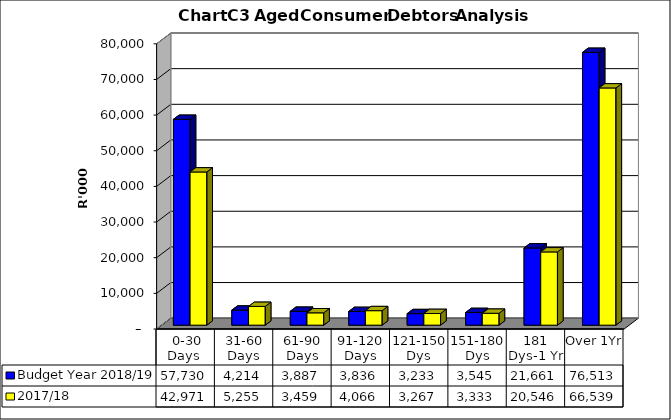
| Category | Budget Year 2018/19 | 2017/18 |
|---|---|---|
|  0-30 Days  | 57729753.52 | 42971345.74 |
| 31-60 Days | 4213513.23 | 5255237.08 |
| 61-90 Days | 3886743.83 | 3458926.4 |
| 91-120 Days | 3836324.48 | 4065554.29 |
| 121-150 Dys | 3233164.09 | 3267220.02 |
| 151-180 Dys | 3544594.38 | 3332626.55 |
| 181 Dys-1 Yr | 21661426.53 | 20545998.14 |
| Over 1Yr | 76512738.07 | 66539239.59 |